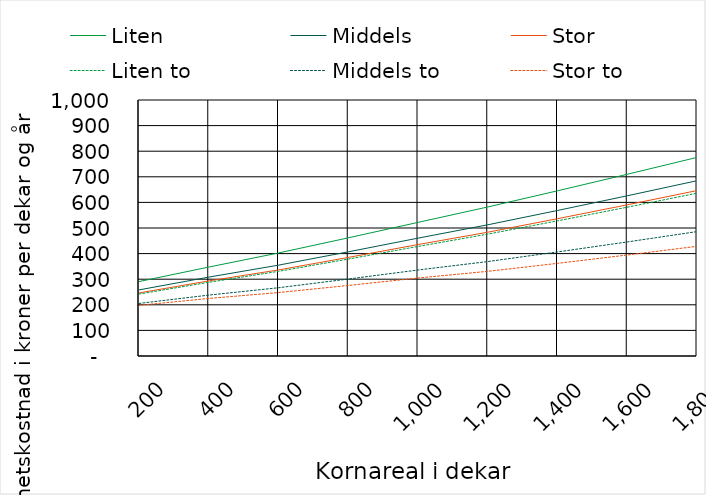
| Category | Liten | Middels | Stor | Liten to | Middels to | Stor to |
|---|---|---|---|---|---|---|
| 200.0 | 290.811 | 258.221 | 246.312 | 241.972 | 205.34 | 197.959 |
| 400.0 | 347.383 | 308.112 | 293.333 | 287.865 | 237.871 | 224.751 |
| 600.0 | 402.48 | 354.9 | 336.161 | 330.691 | 266.643 | 247.783 |
| 800.0 | 461.503 | 406.919 | 385.068 | 378.641 | 300.585 | 275.502 |
| 1000.0 | 521.948 | 460.36 | 435.398 | 428.013 | 335.95 | 304.643 |
| 1200.0 | 582.151 | 512.454 | 483.571 | 476.026 | 368.863 | 330.715 |
| 1400.0 | 645.28 | 568.441 | 536.337 | 527.921 | 406.472 | 361.883 |
| 1600.0 | 709.831 | 625.849 | 590.525 | 581.237 | 445.504 | 394.474 |
| 1800.0 | 775.804 | 684.68 | 646.136 | 635.976 | 485.959 | 428.487 |